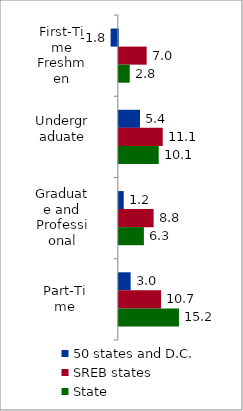
| Category | 50 states and D.C. | SREB states | State |
|---|---|---|---|
| First-Time Freshmen | -1.821 | 7.032 | 2.763 |
| Undergraduate | 5.356 | 11.097 | 10.085 |
| Graduate and Professional | 1.248 | 8.794 | 6.338 |
| Part-Time | 2.994 | 10.678 | 15.192 |